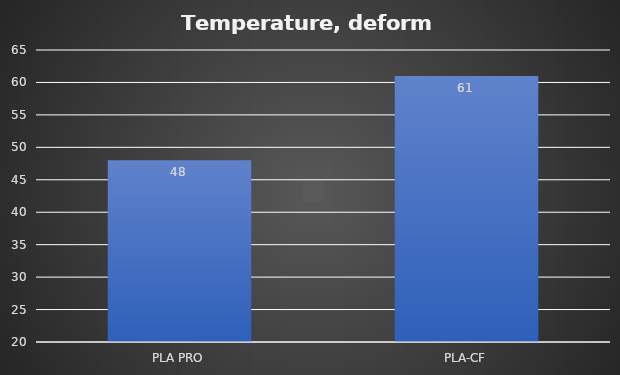
| Category | Deform °C |
|---|---|
| PLA PRO | 48 |
| PLA-CF | 61 |